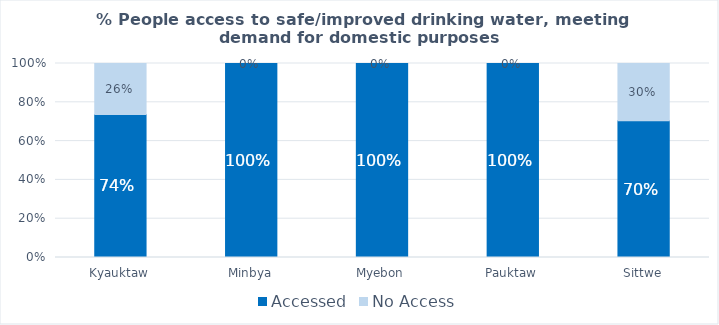
| Category | Accessed | No Access |
|---|---|---|
| Kyauktaw | 0.737 | 0.263 |
| Minbya | 1 | 0 |
| Myebon | 1 | 0 |
| Pauktaw | 1 | 0 |
| Sittwe | 0.705 | 0.295 |